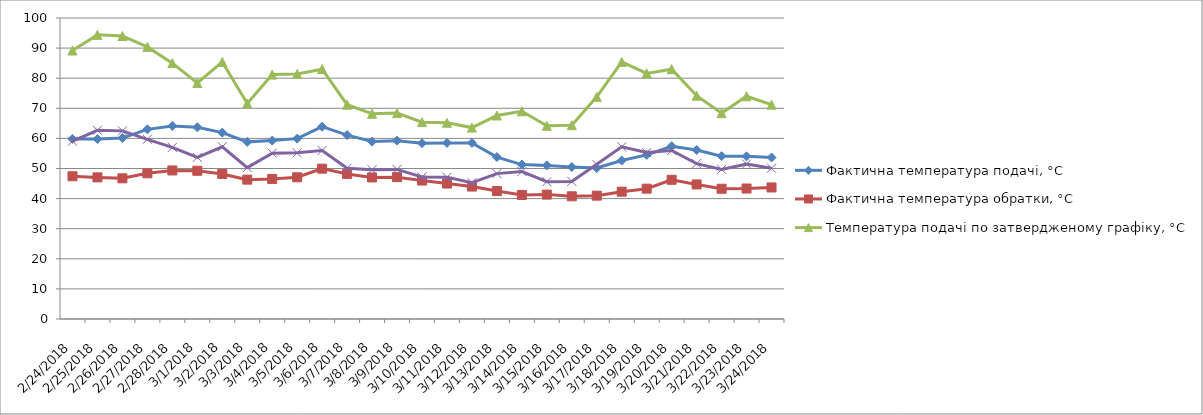
| Category | Фактична температура подачі, °С | Фактична температура обратки, °С | Температура подачі по затвердженому графіку, °С | Температура обратки по затвердженому графіку, °С |
|---|---|---|---|---|
| 2/24/18 | 59.82 | 47.43 | 89.2 | 59.1 |
| 2/25/18 | 59.8 | 47.05 | 94.4 | 62.7 |
| 2/26/18 | 60.13 | 46.73 | 94 | 62.5 |
| 2/27/18 | 63 | 48.4 | 90.4 | 59.7 |
| 2/28/18 | 64.15 | 49.35 | 85 | 57 |
| 3/1/18 | 63.7 | 49.25 | 78.4 | 53.7 |
| 3/2/18 | 61.92 | 48.2 | 85.4 | 57.2 |
| 3/3/18 | 58.85 | 46.3 | 71.6 | 50.3 |
| 3/4/18 | 59.27 | 46.53 | 81.2 | 55.1 |
| 3/5/18 | 59.92 | 47.08 | 81.4 | 55.2 |
| 3/6/18 | 63.9 | 49.95 | 83 | 56 |
| 3/7/18 | 61.1 | 48.18 | 71.2 | 50.1 |
| 3/8/18 | 58.95 | 47.03 | 68.2 | 49.6 |
| 3/9/18 | 59.25 | 47.12 | 68.4 | 49.7 |
| 3/10/18 | 58.4 | 46 | 65.4 | 47.2 |
| 3/11/18 | 58.5 | 45 | 65.2 | 47.1 |
| 3/12/18 | 58.5 | 44 | 63.6 | 45.3 |
| 3/13/18 | 53.8 | 42.5 | 67.6 | 48.3 |
| 3/14/18 | 51.3 | 41.2 | 69 | 49 |
| 3/15/18 | 51.03 | 41.33 | 64.2 | 45.6 |
| 3/16/18 | 50.5 | 40.77 | 64.4 | 45.7 |
| 3/17/18 | 50.15 | 40.98 | 73.8 | 51.4 |
| 3/18/18 | 52.65 | 42.3 | 85.4 | 57.2 |
| 3/19/18 | 54.52 | 43.3 | 81.6 | 55.3 |
| 3/20/18 | 57.4 | 46.25 | 83 | 56 |
| 3/21/18 | 56.15 | 44.7 | 74.2 | 51.6 |
| 3/22/18 | 54.1 | 43.27 | 68.4 | 49.7 |
| 3/23/18 | 54.05 | 43.35 | 74 | 51.5 |
| 3/24/18 | 53.65 | 43.7 | 71.2 | 50.1 |